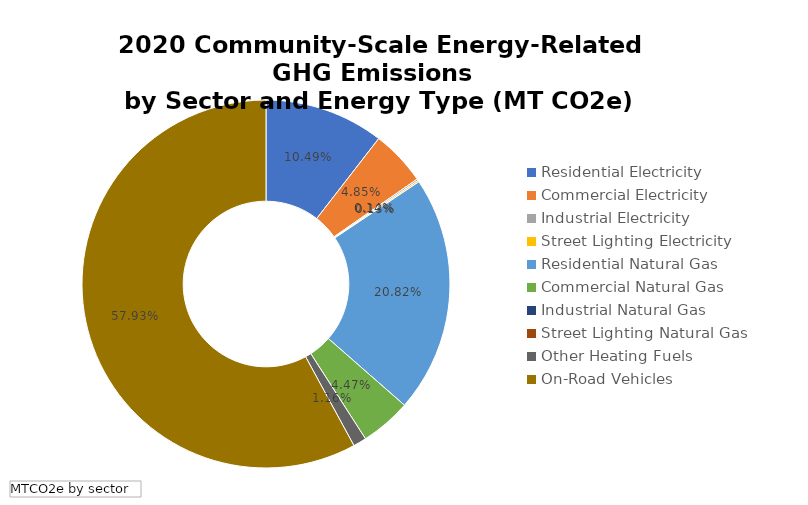
| Category | Total |
|---|---|
| Residential Electricity  | 13295.096 |
| Commercial Electricity  | 6143.593 |
| Industrial Electricity  | 181.324 |
| Street Lighting Electricity  | 168.381 |
| Residential Natural Gas  | 26379.493 |
| Commercial Natural Gas  | 5656.934 |
| Industrial Natural Gas  | 0 |
| Street Lighting Natural Gas  | 0 |
| Other Heating Fuels  | 1468.251 |
| On-Road Vehicles  | 73388.172 |